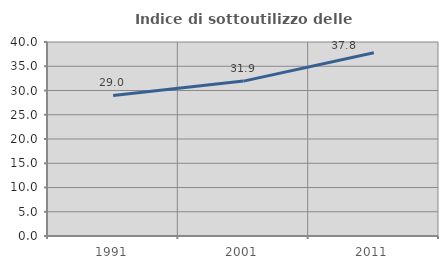
| Category | Indice di sottoutilizzo delle abitazioni  |
|---|---|
| 1991.0 | 28.978 |
| 2001.0 | 31.937 |
| 2011.0 | 37.793 |